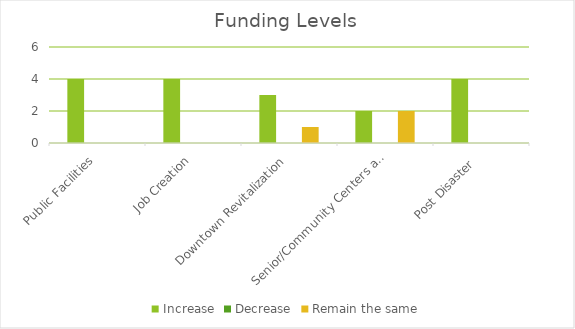
| Category | Increase | Decrease | Remain the same |
|---|---|---|---|
| Public Facilities | 4 | 0 | 0 |
| Job Creation | 4 | 0 | 0 |
| Downtown Revitalization | 3 | 0 | 1 |
| Senior/Community Centers and Parks | 2 | 0 | 2 |
| Post Disaster  | 4 | 0 | 0 |